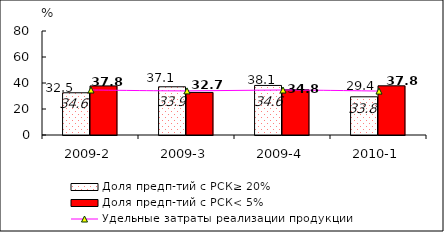
| Category | Доля предп-тий с РСК≥ 20% | Доля предп-тий с РСК< 5% |
|---|---|---|
| 2009-2 | 32.48 | 37.76 |
| 2009-3 | 37.097 | 32.742 |
| 2009-4 | 38.119 | 34.761 |
| 2010-1 | 29.382 | 37.833 |